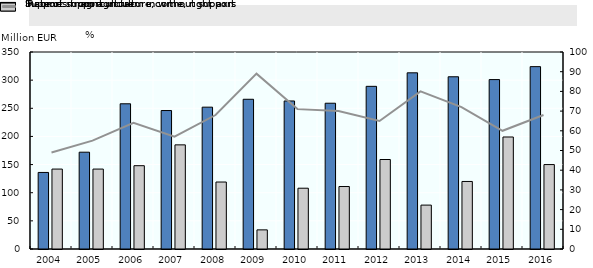
| Category | Support in agriculture | Incomes from agriculture, without support |
|---|---|---|
| 2004.0 | 136 | 142 |
| 2005.0 | 172 | 142 |
| 2006.0 | 258 | 148 |
| 2007.0 | 246 | 185 |
| 2008.0 | 252 | 119 |
| 2009.0 | 266 | 34 |
| 2010.0 | 263 | 108 |
| 2011.0 | 259 | 111 |
| 2012.0 | 289 | 159 |
| 2013.0 | 313 | 78 |
| 2014.0 | 306 | 120 |
| 2015.0 | 301 | 199 |
| 2016.0 | 324 | 150 |